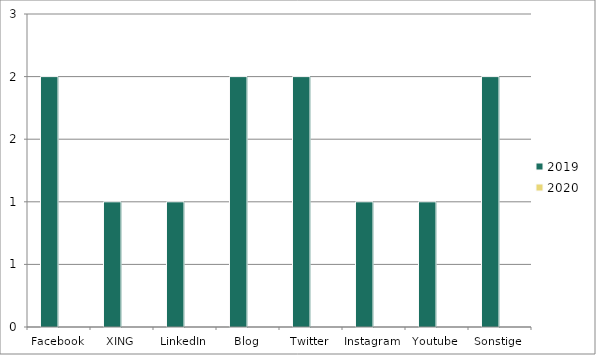
| Category | 2019 | 2020 |
|---|---|---|
| Facebook | 2 | 0 |
| XING | 1 | 0 |
| LinkedIn | 1 | 0 |
| Blog | 2 | 0 |
| Twitter | 2 | 0 |
| Instagram | 1 | 0 |
| Youtube | 1 | 0 |
| Sonstige | 2 | 0 |